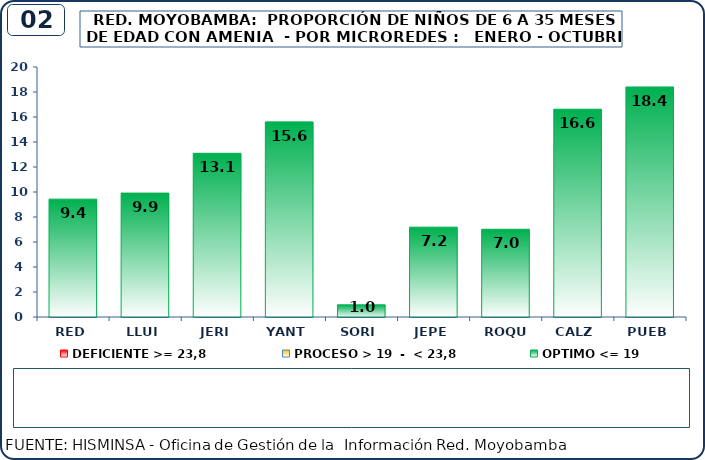
| Category | DEFICIENTE >= 23,8 | PROCESO > 19  -  < 23,8 | OPTIMO <= 19 |
|---|---|---|---|
| RED | 0 | 0 | 9.429 |
| LLUI | 0 | 0 | 9.912 |
| JERI | 0 | 0 | 13.095 |
| YANT | 0 | 0 | 15.612 |
| SORI | 0 | 0 | 0.98 |
| JEPE | 0 | 0 | 7.187 |
| ROQU | 0 | 0 | 7.018 |
| CALZ | 0 | 0 | 16.623 |
| PUEB | 0 | 0 | 18.402 |